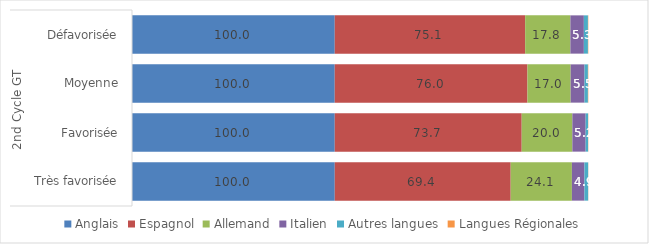
| Category | Anglais | Espagnol | Allemand | Italien | Autres langues | Langues Régionales |
|---|---|---|---|---|---|---|
| 0 | 99.979 | 75.116 | 17.832 | 5.323 | 1.604 | 0.145 |
| 1 | 99.974 | 76.023 | 17.039 | 5.478 | 1.335 | 0.151 |
| 2 | 99.983 | 73.747 | 19.979 | 5.246 | 0.957 | 0.088 |
| 3 | 99.984 | 69.403 | 24.143 | 4.943 | 1.474 | 0.054 |